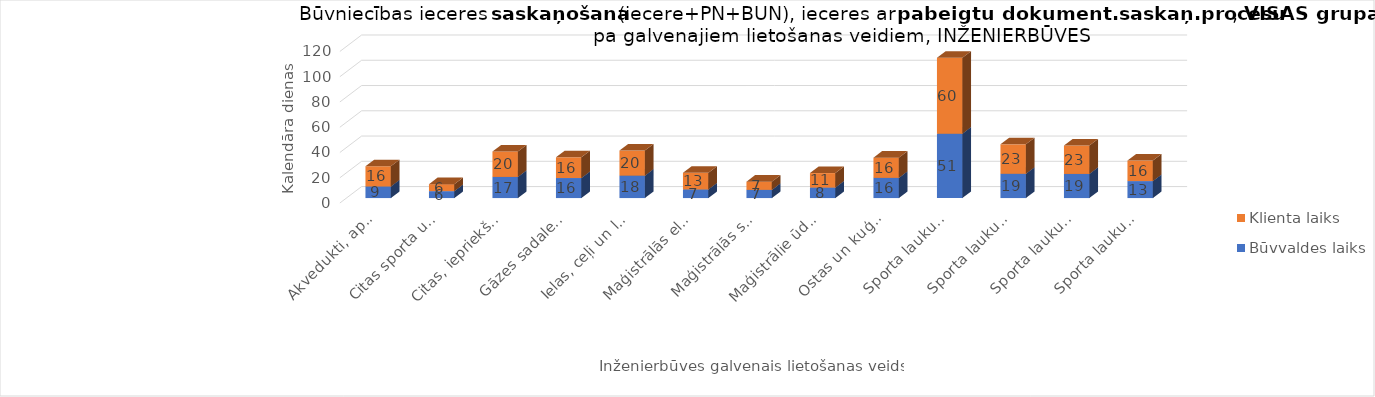
| Category | Būvvaldes laiks | Klienta laiks |
|---|---|---|
| Akvedukti, apūdeņošanas un meliorācijas hidrobūves | 9.182 | 16 |
| Citas sporta un atpūtas būves | 5.5 | 5.5 |
| Citas, iepriekš neklasificētas, inženierbūves | 16.724 | 20.172 |
| Gāzes sadales sistēmas | 15.867 | 16.4 |
| Ielas, ceļi un laukumi | 17.759 | 19.862 |
| Maģistrālās elektropārvades un elektrosadales līnijas | 6.833 | 13.167 |
| Maģistrālās sakaru līnijas | 6.5 | 6.5 |
| Maģistrālie ūdensapgādes cauruļvadi | 8.333 | 11.444 |
| Ostas un kuģojamie kanāli | 16 | 16 |
| Sporta laukumi | 51 | 60 |
| Sporta laukumi | 19.227 | 23.318 |
| Sporta laukumi | 19.1 | 22.5 |
| Sporta laukumi | 13.462 | 16.231 |